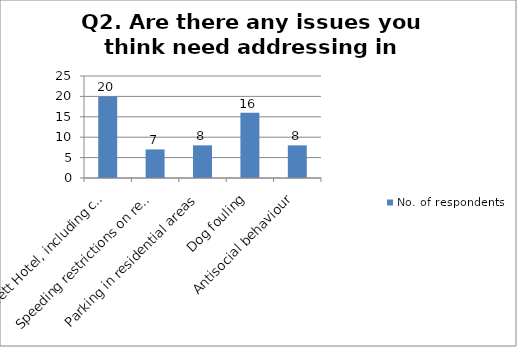
| Category | No. of respondents |
|---|---|
| Roggiett Hotel, including compulsory purchase suggestion | 20 |
| Speeding restrictions on residential roads | 7 |
| Parking in residential areas | 8 |
| Dog fouling | 16 |
| Antisocial behaviour | 8 |